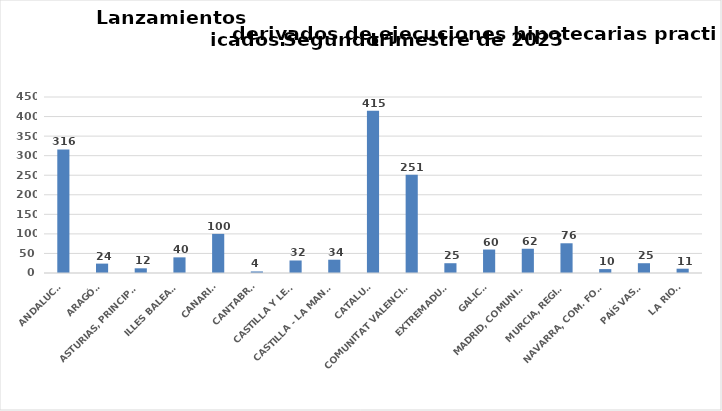
| Category | Series 0 |
|---|---|
| ANDALUCÍA | 316 |
| ARAGÓN | 24 |
| ASTURIAS, PRINCIPADO | 12 |
| ILLES BALEARS | 40 |
| CANARIAS | 100 |
| CANTABRIA | 4 |
| CASTILLA Y LEÓN | 32 |
| CASTILLA - LA MANCHA | 34 |
| CATALUÑA | 415 |
| COMUNITAT VALENCIANA | 251 |
| EXTREMADURA | 25 |
| GALICIA | 60 |
| MADRID, COMUNIDAD | 62 |
| MURCIA, REGIÓN | 76 |
| NAVARRA, COM. FORAL | 10 |
| PAÍS VASCO | 25 |
| LA RIOJA | 11 |